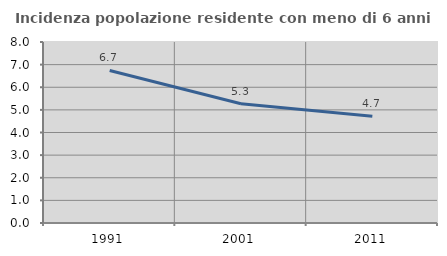
| Category | Incidenza popolazione residente con meno di 6 anni |
|---|---|
| 1991.0 | 6.744 |
| 2001.0 | 5.274 |
| 2011.0 | 4.72 |